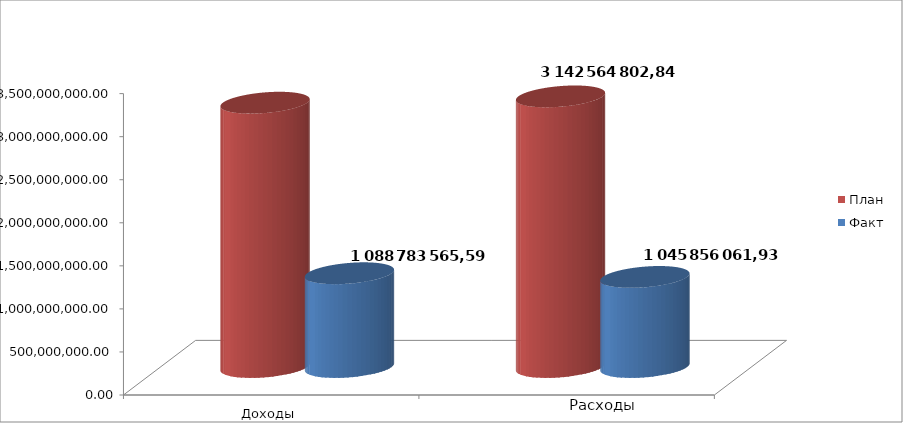
| Category | План | Факт |
|---|---|---|
| 0 | 3069331783.96 | 1088783565.59 |
| 1 | 3142564802.84 | 1045856061.93 |